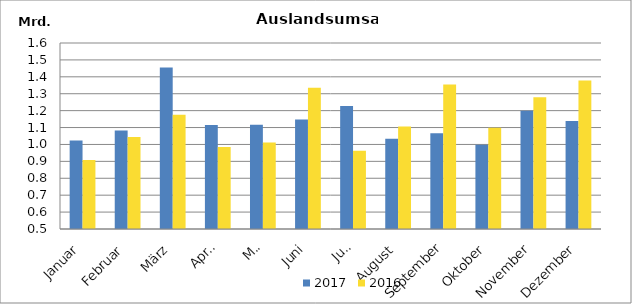
| Category | 2017 | 2016 |
|---|---|---|
| Januar | 1022920 | 908041.216 |
| Februar | 1083106.625 | 1043967.393 |
| März | 1455211.351 | 1176299.248 |
| April | 1115715.142 | 984327.442 |
| Mai | 1116344.226 | 1012202.669 |
| Juni | 1147372.055 | 1335944.135 |
| Juli | 1228111.605 | 963073.489 |
| August | 1034143.224 | 1105927.123 |
| September | 1065907.066 | 1354575.029 |
| Oktober | 998091.482 | 1098954.975 |
| November | 1198647.326 | 1279048.084 |
| Dezember | 1138974.462 | 1378764.26 |